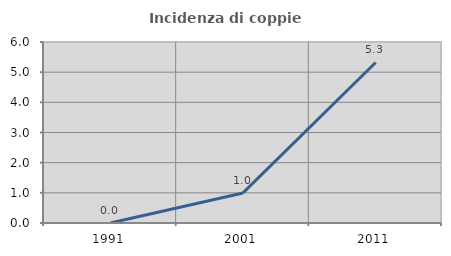
| Category | Incidenza di coppie miste |
|---|---|
| 1991.0 | 0 |
| 2001.0 | 0.997 |
| 2011.0 | 5.322 |